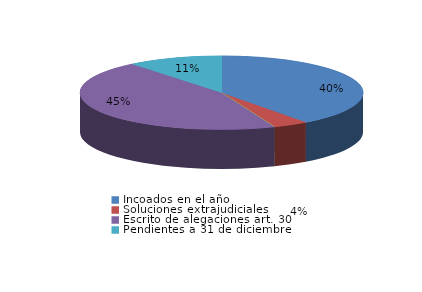
| Category | Series 0 |
|---|---|
| Incoados en el año | 59 |
| Soluciones extrajudiciales | 6 |
| Sobreseimiento del art. 27.4 | 0 |
| Escrito de alegaciones art. 30 | 67 |
| Pendientes a 31 de diciembre | 16 |